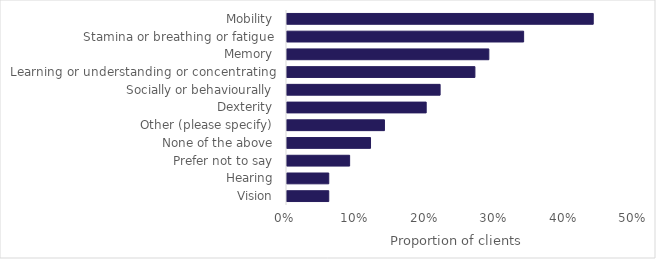
| Category | Series 0 |
|---|---|
| Vision | 0.06 |
| Hearing | 0.06 |
| Prefer not to say | 0.09 |
| None of the above | 0.12 |
| Other (please specify) | 0.14 |
| Dexterity | 0.2 |
| Socially or behaviourally | 0.22 |
| Learning or understanding or concentrating | 0.27 |
| Memory | 0.29 |
| Stamina or breathing or fatigue | 0.34 |
| Mobility | 0.44 |